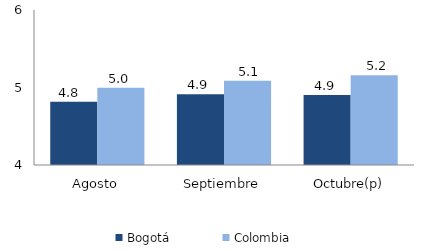
| Category | Bogotá | Colombia |
|---|---|---|
| Agosto | 4.816 | 4.996 |
| Septiembre | 4.912 | 5.086 |
| Octubre(p) | 4.902 | 5.158 |